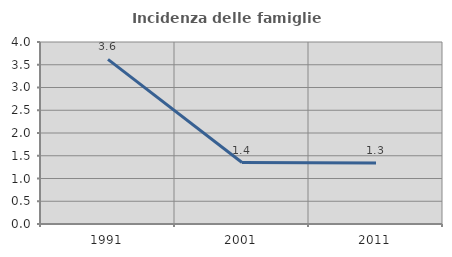
| Category | Incidenza delle famiglie numerose |
|---|---|
| 1991.0 | 3.618 |
| 2001.0 | 1.351 |
| 2011.0 | 1.341 |